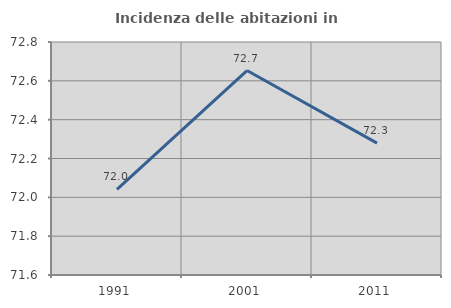
| Category | Incidenza delle abitazioni in proprietà  |
|---|---|
| 1991.0 | 72.041 |
| 2001.0 | 72.653 |
| 2011.0 | 72.279 |